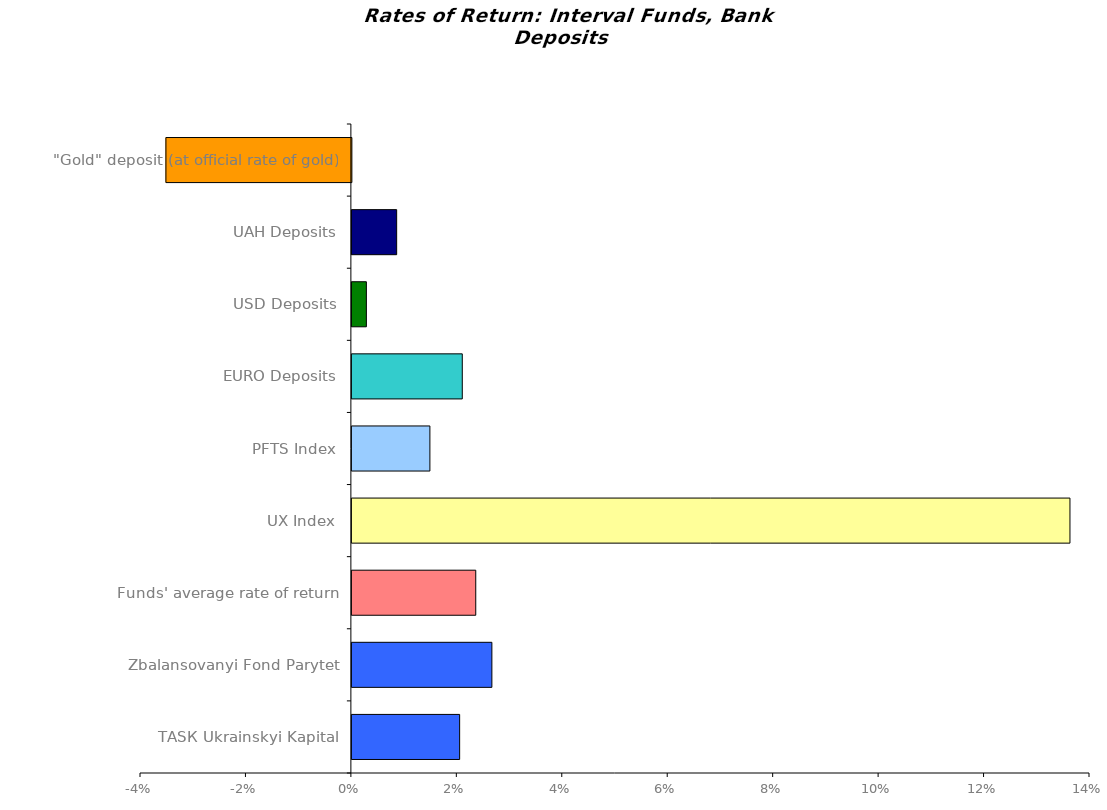
| Category | Series 0 |
|---|---|
| ТАSК Ukrainskyi Kapital | 0.02 |
| Zbalansovanyi Fond Parytet | 0.027 |
| Funds' average rate of return | 0.023 |
| UX Index | 0.136 |
| PFTS Index | 0.015 |
| EURO Deposits | 0.021 |
| USD Deposits | 0.003 |
| UAH Deposits | 0.008 |
| "Gold" deposit (at official rate of gold) | -0.035 |